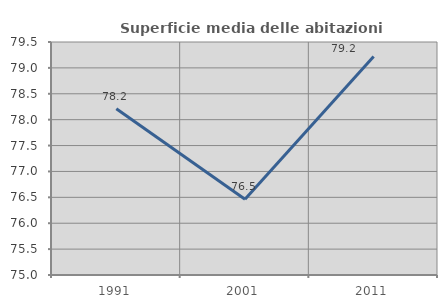
| Category | Superficie media delle abitazioni occupate |
|---|---|
| 1991.0 | 78.21 |
| 2001.0 | 76.461 |
| 2011.0 | 79.221 |